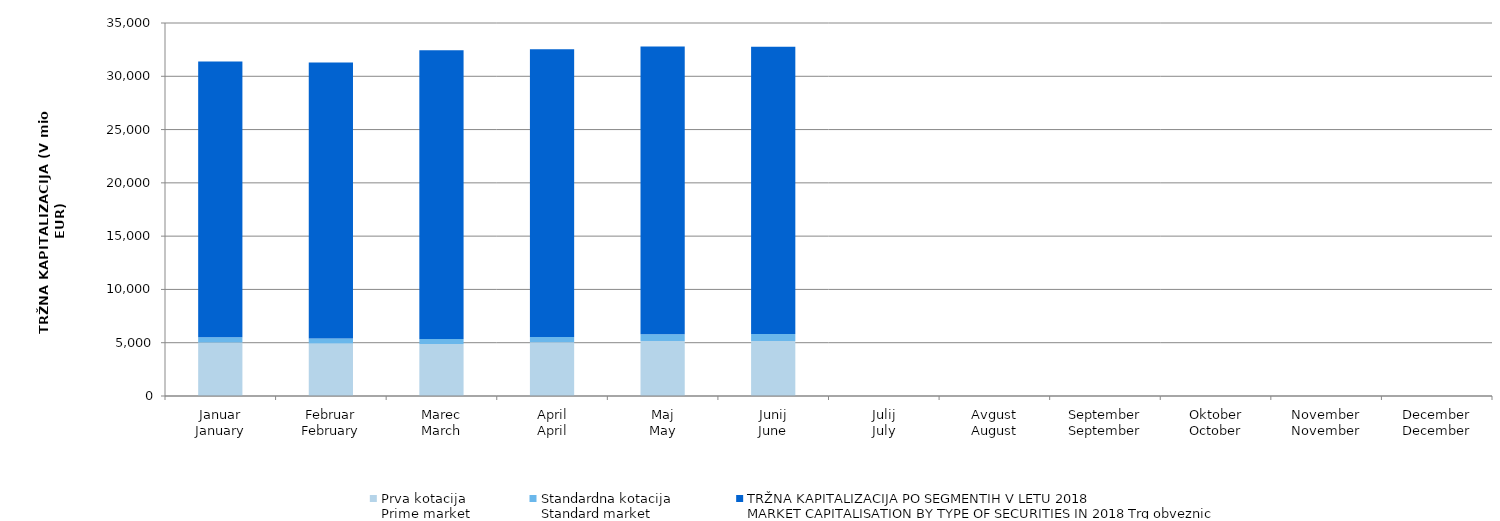
| Category | Prva kotacija
Prime market | Standardna kotacija
Standard market | Series 3 |
|---|---|---|---|
| Januar
January | 5022.792 | 483.67 | 25885.901 |
| Februar
February | 4922.405 | 471.165 | 25899.375 |
| Marec
March | 4884.025 | 463.212 | 27099.633 |
| April
April | 5038.448 | 492.653 | 27015.924 |
| Maj
May | 5153.368 | 630.304 | 27015.655 |
| Junij
June | 5151.963 | 663.065 | 26962.481 |
| Julij
July | 0 | 0 | 0 |
| Avgust
August | 0 | 0 | 0 |
| September
September | 0 | 0 | 0 |
| Oktober
October | 0 | 0 | 0 |
| November
November | 0 | 0 | 0 |
| December
December | 0 | 0 | 0 |